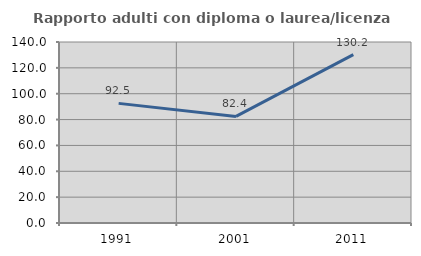
| Category | Rapporto adulti con diploma o laurea/licenza media  |
|---|---|
| 1991.0 | 92.523 |
| 2001.0 | 82.424 |
| 2011.0 | 130.22 |